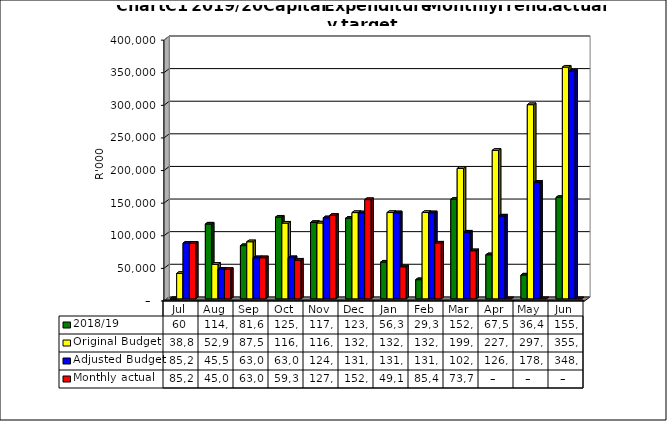
| Category | 2018/19 | Original Budget | Adjusted Budget | Monthly actual |
|---|---|---|---|---|
| Jul | 59892 | 38885000 | 85297669.12 | 85297669.118 |
| Aug | 114658356.076 | 52927000 | 45515291.767 | 45020698.985 |
| Sep | 81613647.633 | 87521000 | 63024484.609 | 63024484.609 |
| Oct | 125253452.407 | 116093000 | 63068303.312 | 59349467.812 |
| Nov | 117057421.925 | 116300000 | 124247725.67 | 127966561.363 |
| Dec | 123680771.708 | 132266000 | 131868000 | 152138184.79 |
| Jan | 56304819.372 | 132336000 | 131938000 | 49120173.272 |
| Feb | 29352943.088 | 132336000 | 131938000 | 85478228.192 |
| Mar | 152645868.565 | 199883000 | 102308990 | 73737271.004 |
| Apr | 67570203.105 | 227676000 | 126991000 | 0 |
| May | 36486409.167 | 297703000 | 178808000 | 0 |
| Jun | 155412588.422 | 355259999.6 | 348653637.522 | 0 |